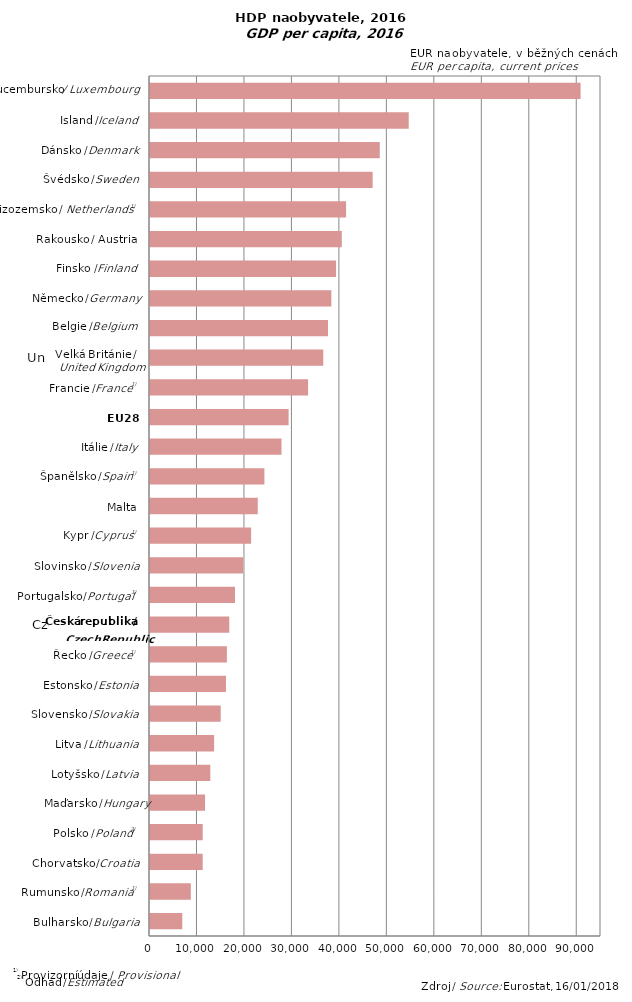
| Category | Series 0 |
|---|---|
| Bulgaria | 6800 |
| Romania | 8600 |
| Croatia | 11100 |
| Poland | 11100 |
| Hungary | 11600 |
| Latvia | 12700 |
| Lithuania | 13500 |
| Slovakia | 14900 |
| Estonia | 16000 |
| Greece | 16200 |
| Czech Republic | 16700 |
| Portugal | 17900 |
| Slovenia | 19600 |
| Cyprus | 21300 |
| Malta | 22700 |
| Spain | 24100 |
| Italy | 27700 |
| EU 28 | 29200 |
| France | 33300 |
| United Kingdom | 36500 |
| Belgium | 37500 |
| Germany | 38200 |
| Finland | 39200 |
| Austria | 40400 |
| Netherlands | 41300 |
| Sweden | 46900 |
| Denmark | 48400 |
| Iceland | 54500 |
| Luxembourg | 90700 |